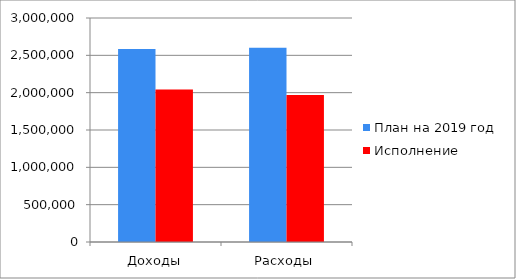
| Category | План на 2019 год | Исполнение |
|---|---|---|
| Доходы | 2585137 | 2043411 |
| Расходы | 2602901 | 1970375 |